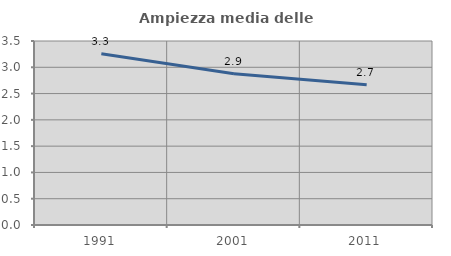
| Category | Ampiezza media delle famiglie |
|---|---|
| 1991.0 | 3.257 |
| 2001.0 | 2.877 |
| 2011.0 | 2.666 |